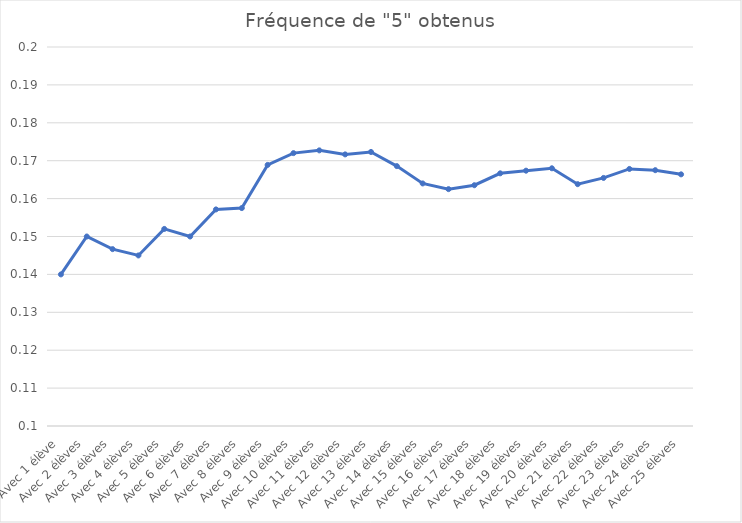
| Category | Fréquence de "5" obtenus |
|---|---|
| Avec 1 élève | 0.14 |
| Avec 2 élèves | 0.15 |
| Avec 3 élèves | 0.147 |
| Avec 4 élèves | 0.145 |
| Avec 5 élèves | 0.152 |
| Avec 6 élèves | 0.15 |
| Avec 7 élèves | 0.157 |
| Avec 8 élèves | 0.158 |
| Avec 9 élèves | 0.169 |
| Avec 10 élèves | 0.172 |
| Avec 11 élèves | 0.173 |
| Avec 12 élèves | 0.172 |
| Avec 13 élèves | 0.172 |
| Avec 14 élèves | 0.169 |
| Avec 15 élèves | 0.164 |
| Avec 16 élèves | 0.162 |
| Avec 17 élèves | 0.164 |
| Avec 18 élèves | 0.167 |
| Avec 19 élèves | 0.167 |
| Avec 20 élèves | 0.168 |
| Avec 21 élèves | 0.164 |
| Avec 22 élèves | 0.165 |
| Avec 23 élèves | 0.168 |
| Avec 24 élèves | 0.168 |
| Avec 25 élèves | 0.166 |